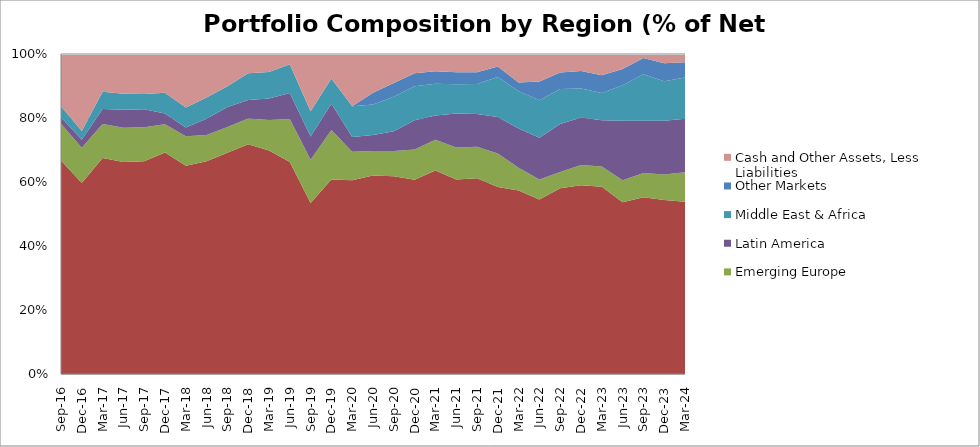
| Category | East & South Asia | Emerging Europe | Latin America | Middle East & Africa | Other Markets | Cash and Other Assets, Less Liabilities |
|---|---|---|---|---|---|---|
| 2016-09-30 | 66.7 | 11.47 | 2.07 | 3.42 | 0 | 16.34 |
| 2016-12-31 | 59.7 | 11 | 2.48 | 2.73 | 0 | 24.09 |
| 2017-03-31 | 67.518 | 10.56 | 4.71 | 5.41 | 0 | 11.79 |
| 2017-06-30 | 66.246 | 10.673 | 5.678 | 4.968 | 0 | 12.434 |
| 2017-09-30 | 66.52 | 10.57 | 5.61 | 4.79 | 0 | 12.51 |
| 2017-12-31 | 69.25 | 8.8 | 3.37 | 6.45 | 0 | 12.13 |
| 2018-03-31 | 65.11 | 9.2 | 2.7 | 6.24 | 0 | 16.75 |
| 2018-06-30 | 66.514 | 8.2 | 5.02 | 6.67 | 0 | 13.6 |
| 2018-09-30 | 69.11 | 8.08 | 6.23 | 6.5 | 0 | 10.08 |
| 2018-12-31 | 71.79 | 8.08 | 5.77 | 8.32 | 0 | 6.04 |
| 2019-03-31 | 69.87 | 9.48 | 6.75 | 8.3 | 0 | 5.6 |
| 2019-06-30 | 66.23 | 13.44 | 8.17 | 8.98 | 0 | 3.18 |
| 2019-09-30 | 53.42 | 13.5 | 7.31 | 7.9 | 0 | 17.87 |
| 2019-12-31 | 60.82 | 15.45 | 8.19 | 7.86 | 0 | 7.68 |
| 2020-03-31 | 60.53 | 8.91 | 4.65 | 9.59 | 0 | 16.32 |
| 2020-06-30 | 62.05 | 7.67 | 4.96 | 9.5 | 3.73 | 12.09 |
| 2020-09-30 | 61.78 | 7.93 | 6.13 | 10.77 | 4.34 | 9.05 |
| 2020-12-31 | 60.68 | 9.47 | 9.12 | 10.67 | 4.02 | 6.04 |
| 2021-03-31 | 63.57 | 9.6 | 7.65 | 9.9 | 3.91 | 5.37 |
| 2021-06-30 | 60.77 | 10.03 | 10.6 | 9.13 | 3.8 | 5.67 |
| 2021-09-30 | 61.15 | 9.83 | 10.28 | 9.38 | 3.68 | 5.68 |
| 2021-12-31 | 58.47 | 10.46 | 11.35 | 12.56 | 3.29 | 3.87 |
| 2022-03-31 | 57.32 | 7.16 | 12.26 | 11.59 | 2.75 | 8.92 |
| 2022-06-30 | 54.57 | 6.18 | 13.09 | 11.72 | 5.88 | 8.56 |
| 2022-09-30 | 58.08 | 5.01 | 15.01 | 10.99 | 5.1 | 5.81 |
| 2022-12-31 | 58.97 | 6.36 | 14.83 | 9.04 | 5.45 | 5.35 |
| 2023-03-31 | 58.53 | 6.32 | 14.48 | 8.47 | 5.55 | 6.65 |
| 2023-06-30 | 53.69 | 6.83 | 18.59 | 11.1 | 5.14 | 4.65 |
| 2023-09-30 | 55.23 | 7.6 | 16.32 | 14.52 | 5.09 | 1.24 |
| 2023-12-31 | 54.38 | 7.93 | 16.84 | 12.32 | 5.61 | 2.92 |
| 2024-03-31 | 53.79 | 9.27 | 16.74 | 12.87 | 4.78 | 2.55 |